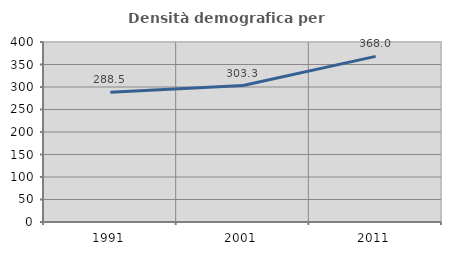
| Category | Densità demografica |
|---|---|
| 1991.0 | 288.525 |
| 2001.0 | 303.289 |
| 2011.0 | 368.049 |